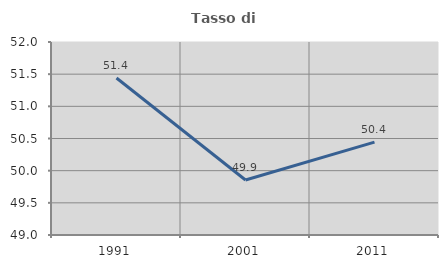
| Category | Tasso di occupazione   |
|---|---|
| 1991.0 | 51.44 |
| 2001.0 | 49.856 |
| 2011.0 | 50.444 |